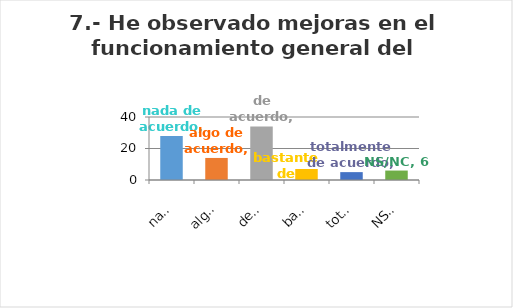
| Category | Series 0 |
|---|---|
| nada de acuerdo | 28 |
| algo de acuerdo | 14 |
| de acuerdo | 34 |
| bastante de acuerdo | 7 |
| totalmente de acuerdo | 5 |
| NS/NC | 6 |